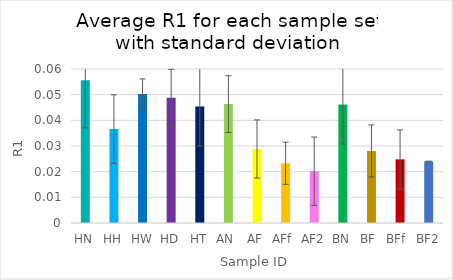
| Category | Average R1 |
|---|---|
| HN | 0.056 |
| HH | 0.037 |
| HW | 0.05 |
| HD | 0.049 |
| HT | 0.045 |
| AN  | 0.046 |
| AF | 0.029 |
| AFf  | 0.023 |
| AF2 | 0.02 |
| BN | 0.046 |
| BF  | 0.028 |
| BFf  | 0.025 |
| BF2 | 0.024 |